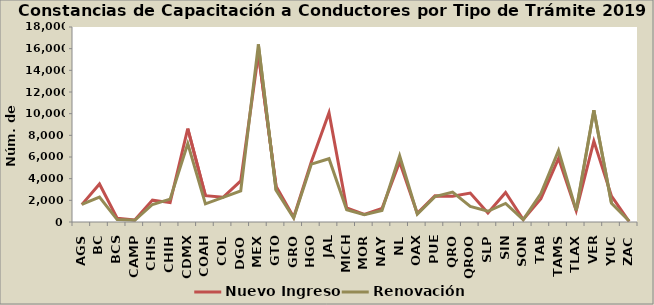
| Category | Nuevo Ingreso | Renovación |
|---|---|---|
| AGS | 1605 | 1635 |
| BC | 3509 | 2304 |
| BCS | 352 | 226 |
| CAMP | 182 | 159 |
| CHIS | 2025 | 1616 |
| CHIH | 1785 | 2109 |
| CDMX | 8626 | 7236 |
| COAH | 2428 | 1679 |
| COL | 2280 | 2278 |
| DGO | 3791 | 2875 |
| MEX | 15529 | 16402 |
| GTO | 3307 | 2943 |
| GRO | 445 | 370 |
| HGO | 5561 | 5345 |
| JAL | 10087 | 5843 |
| MICH | 1289 | 1127 |
| MOR | 706 | 668 |
| NAY | 1251 | 1069 |
| NL | 5543 | 6117 |
| OAX | 793 | 732 |
| PUE | 2417 | 2347 |
| QRO | 2382 | 2764 |
| QROO | 2670 | 1430 |
| SLP | 834 | 989 |
| SIN | 2729 | 1715 |
| SON | 231 | 217 |
| TAB | 2151 | 2617 |
| TAMS | 5872 | 6597 |
| TLAX | 1051 | 1075 |
| VER | 7463 | 10324 |
| YUC | 2388 | 1720 |
| ZAC | 36 | 88 |